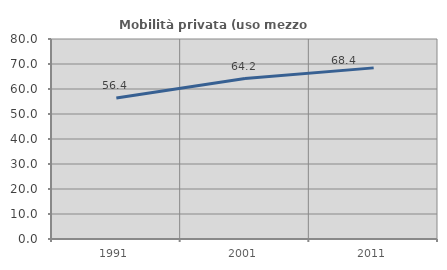
| Category | Mobilità privata (uso mezzo privato) |
|---|---|
| 1991.0 | 56.425 |
| 2001.0 | 64.171 |
| 2011.0 | 68.449 |